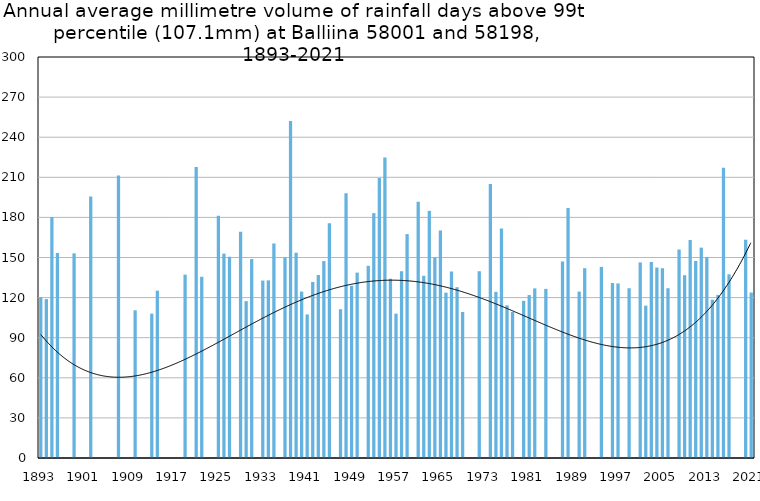
| Category | Annual average mm in days above 99th percentile |
|---|---|
| 1893 | 120.3 |
| 1894 | 118.9 |
| 1895 | 180.3 |
| 1896 | 153.45 |
| 1897 | 0 |
| 1898 | 0 |
| 1899 | 153.1 |
| 1900 | 0 |
| 1901 | 0 |
| 1902 | 195.6 |
| 1903 | 0 |
| 1904 | 0 |
| 1905 | 0 |
| 1906 | 0 |
| 1907 | 211.3 |
| 1908 | 0 |
| 1909 | 0 |
| 1910 | 110.5 |
| 1911 | 0 |
| 1912 | 0 |
| 1913 | 108 |
| 1914 | 125.2 |
| 1915 | 0 |
| 1916 | 0 |
| 1917 | 0 |
| 1918 | 0 |
| 1919 | 137.2 |
| 1920 | 0 |
| 1921 | 217.65 |
| 1922 | 135.6 |
| 1923 | 0 |
| 1924 | 0 |
| 1925 | 181.25 |
| 1926 | 152.9 |
| 1927 | 150.5 |
| 1928 | 0 |
| 1929 | 169.35 |
| 1930 | 117.35 |
| 1931 | 148.825 |
| 1932 | 0 |
| 1933 | 132.75 |
| 1934 | 132.9 |
| 1935 | 160.5 |
| 1936 | 0 |
| 1937 | 150.05 |
| 1938 | 252.2 |
| 1939 | 153.55 |
| 1940 | 124.5 |
| 1941 | 107.4 |
| 1942 | 131.7 |
| 1943 | 136.9 |
| 1944 | 147.3 |
| 1945 | 175.65 |
| 1946 | 0 |
| 1947 | 111.3 |
| 1948 | 198.1 |
| 1949 | 128.95 |
| 1950 | 138.7 |
| 1951 | 0 |
| 1952 | 143.8 |
| 1953 | 183.175 |
| 1954 | 209.55 |
| 1955 | 224.8 |
| 1956 | 134.1 |
| 1957 | 108 |
| 1958 | 139.7 |
| 1959 | 167.5 |
| 1960 | 0 |
| 1961 | 191.8 |
| 1962 | 136.329 |
| 1963 | 184.9 |
| 1964 | 150.1 |
| 1965 | 170.2 |
| 1966 | 123.7 |
| 1967 | 139.45 |
| 1968 | 127.8 |
| 1969 | 109.2 |
| 1970 | 0 |
| 1971 | 0 |
| 1972 | 139.733 |
| 1973 | 0 |
| 1974 | 204.95 |
| 1975 | 124.3 |
| 1976 | 171.7 |
| 1977 | 114.2 |
| 1978 | 109.3 |
| 1979 | 0 |
| 1980 | 117.6 |
| 1981 | 121.9 |
| 1982 | 126.9 |
| 1983 | 0 |
| 1984 | 126.533 |
| 1985 | 0 |
| 1986 | 0 |
| 1987 | 147 |
| 1988 | 187 |
| 1989 | 0 |
| 1990 | 124.5 |
| 1991 | 142 |
| 1992 | 0 |
| 1993 | 0 |
| 1994 | 143 |
| 1995 | 0 |
| 1996 | 131 |
| 1997 | 130.6 |
| 1998 | 0 |
| 1999 | 127 |
| 2000 | 0 |
| 2001 | 146.333 |
| 2002 | 114 |
| 2003 | 146.667 |
| 2004 | 142.5 |
| 2005 | 142 |
| 2006 | 127 |
| 2007 | 0 |
| 2008 | 156 |
| 2009 | 136.8 |
| 2010 | 163.1 |
| 2011 | 147.4 |
| 2012 | 157.4 |
| 2013 | 150.2 |
| 2014 | 118.4 |
| 2015 | 122 |
| 2016 | 217.2 |
| 2017 | 137.4 |
| 2018 | 0 |
| 2019 | 0 |
| 2020 | 163.3 |
| 2021 | 123.8 |